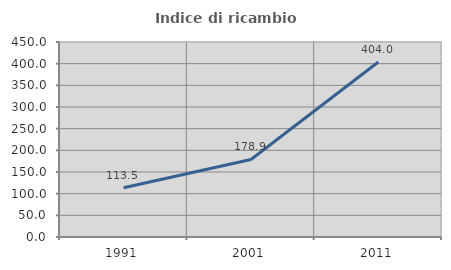
| Category | Indice di ricambio occupazionale  |
|---|---|
| 1991.0 | 113.531 |
| 2001.0 | 178.906 |
| 2011.0 | 403.971 |